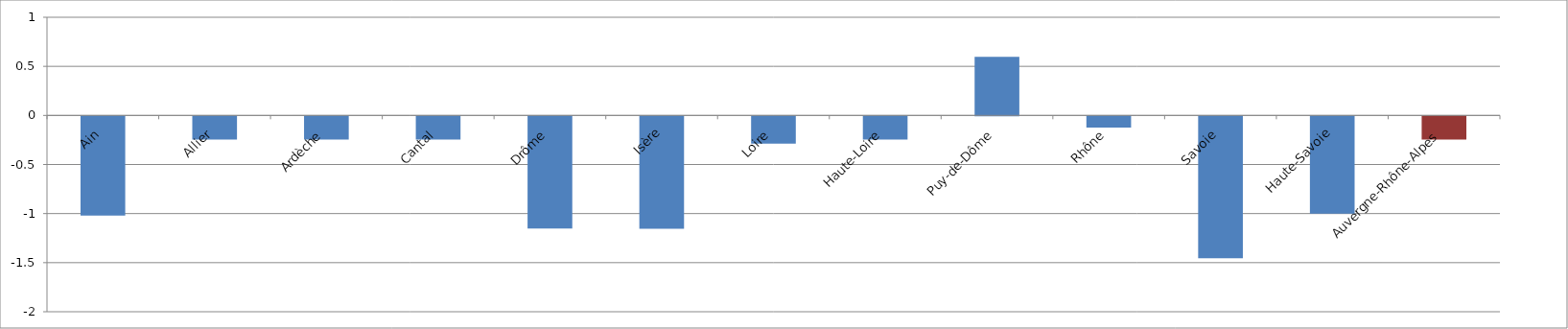
| Category | Tension |
|---|---|
| Ain | -1.011 |
| Allier | -0.236 |
| Ardèche | -0.236 |
| Cantal | -0.236 |
| Drôme | -1.142 |
| Isère | -1.145 |
| Loire | -0.277 |
| Haute-Loire | -0.236 |
| Puy-de-Dôme | 0.597 |
| Rhône | -0.114 |
| Savoie | -1.446 |
| Haute-Savoie | -0.992 |
| Auvergne-Rhône-Alpes | -0.236 |